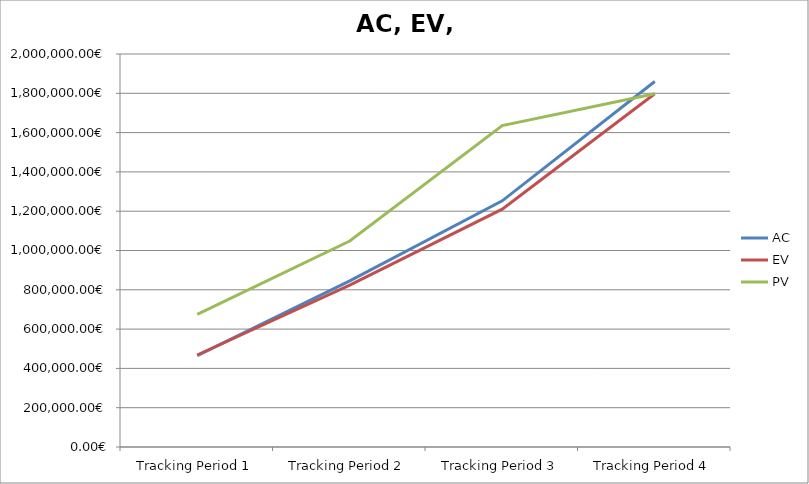
| Category | AC | EV | PV |
|---|---|---|---|
| Tracking Period 1 | 465147.273 | 468163.273 | 674943.562 |
| Tracking Period 2 | 845599.266 | 823680.266 | 1048441.438 |
| Tracking Period 3 | 1252692.758 | 1210111.758 | 1635939.227 |
| Tracking Period 4 | 1860330.617 | 1797873.617 | 1797873.617 |